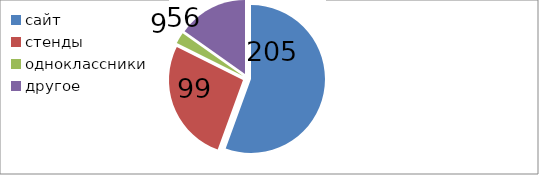
| Category | Series 0 |
|---|---|
| сайт | 205 |
| стенды | 99 |
| одноклассники | 9 |
| другое | 56 |